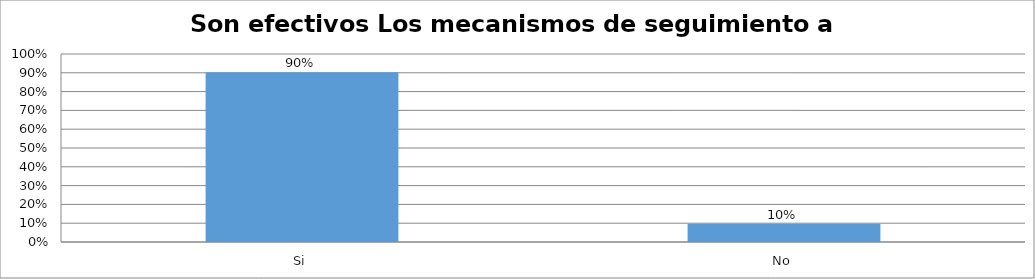
| Category | Series 0 |
|---|---|
| Si | 0.902 |
| No | 0.098 |